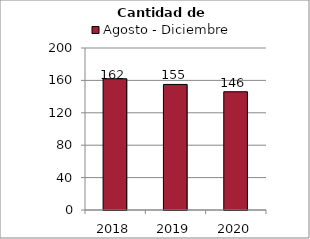
| Category | Agosto - Diciembre |
|---|---|
| 2018.0 | 162 |
| 2019.0 | 155 |
| 2020.0 | 146 |